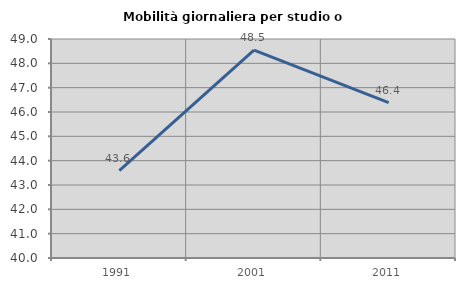
| Category | Mobilità giornaliera per studio o lavoro |
|---|---|
| 1991.0 | 43.596 |
| 2001.0 | 48.544 |
| 2011.0 | 46.383 |